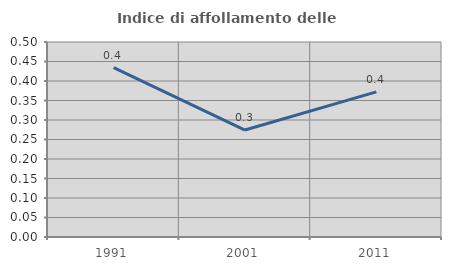
| Category | Indice di affollamento delle abitazioni  |
|---|---|
| 1991.0 | 0.434 |
| 2001.0 | 0.274 |
| 2011.0 | 0.372 |